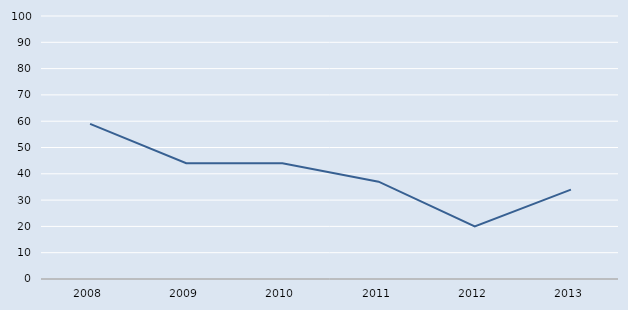
| Category | Series 0 |
|---|---|
| 2008.0 | 59 |
| 2009.0 | 44 |
| 2010.0 | 44 |
| 2011.0 | 37 |
| 2012.0 | 20 |
| 2013.0 | 34 |